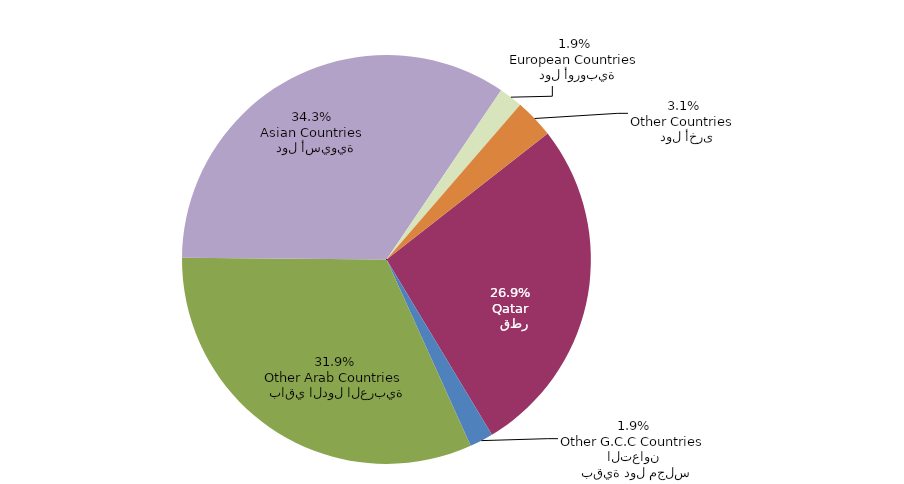
| Category | Series 0 |
|---|---|
|   قطر
Qatar | 1631 |
|   بقية دول مجلس التعاون
Other G.C.C Countries | 113 |
|   باقي الدول العربية
Other Arab Countries | 1931 |
|   دول أسيوية
Asian Countries | 2079 |
|   دول أوروبية
European Countries | 113 |
|   دول أخرى
Other Countries | 188 |